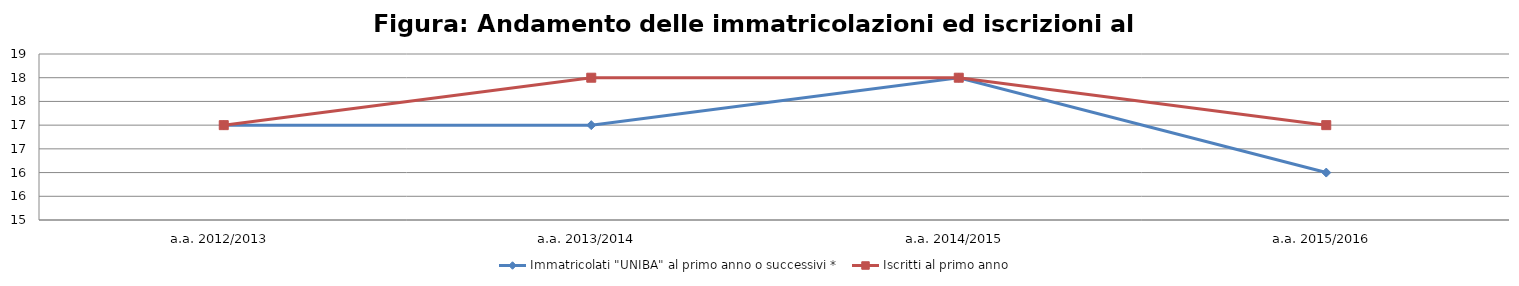
| Category | Immatricolati "UNIBA" al primo anno o successivi * | Iscritti al primo anno  |
|---|---|---|
| a.a. 2012/2013 | 17 | 17 |
| a.a. 2013/2014 | 17 | 18 |
| a.a. 2014/2015 | 18 | 18 |
| a.a. 2015/2016 | 16 | 17 |